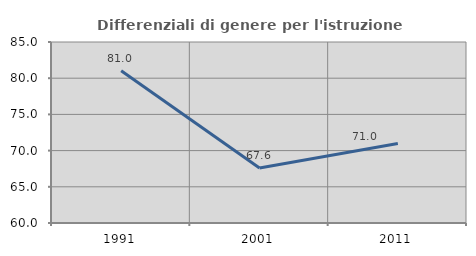
| Category | Differenziali di genere per l'istruzione superiore |
|---|---|
| 1991.0 | 81.031 |
| 2001.0 | 67.59 |
| 2011.0 | 70.985 |